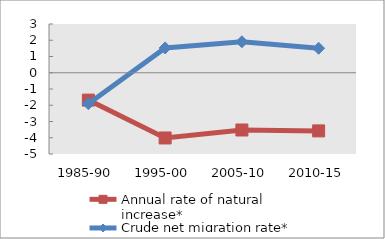
| Category | Annual rate of natural increase* | Crude net migration rate* |
|---|---|---|
| 1985-90 | -1.683 | -1.904 |
| 1995-00 | -4.013 | 1.527 |
| 2005-10 | -3.523 | 1.905 |
| 2010-15 | -3.578 | 1.506 |